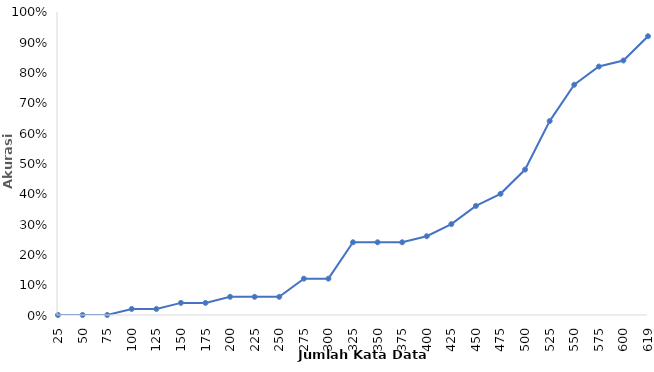
| Category | Series 0 |
|---|---|
| 25 | 0 |
| 50 | 0 |
| 75 | 0 |
| 100 | 0.02 |
| 125 | 0.02 |
| 150 | 0.04 |
| 175 | 0.04 |
| 200 | 0.06 |
| 225 | 0.06 |
| 250 | 0.06 |
| 275 | 0.12 |
| 300 | 0.12 |
| 325 | 0.24 |
| 350 | 0.24 |
| 375 | 0.24 |
| 400 | 0.26 |
| 425 | 0.3 |
| 450 | 0.36 |
| 475 | 0.4 |
| 500 | 0.48 |
| 525 | 0.64 |
| 550 | 0.76 |
| 575 | 0.82 |
| 600 | 0.84 |
| 619 | 0.92 |